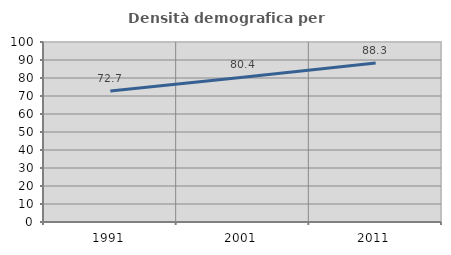
| Category | Densità demografica |
|---|---|
| 1991.0 | 72.736 |
| 2001.0 | 80.428 |
| 2011.0 | 88.309 |